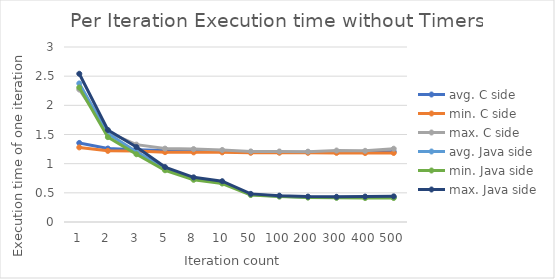
| Category | avg. C side | min. C side | max. C side | avg. Java side | min. Java side | max. Java side |
|---|---|---|---|---|---|---|
| 1.0 | 1.355 | 1.279 | 2.271 | 2.375 | 2.306 | 2.541 |
| 2.0 | 1.26 | 1.22 | 1.542 | 1.516 | 1.455 | 1.578 |
| 3.0 | 1.24 | 1.216 | 1.327 | 1.206 | 1.161 | 1.285 |
| 5.0 | 1.224 | 1.198 | 1.258 | 0.912 | 0.887 | 0.941 |
| 8.0 | 1.212 | 1.194 | 1.25 | 0.738 | 0.724 | 0.765 |
| 10.0 | 1.208 | 1.194 | 1.235 | 0.678 | 0.66 | 0.699 |
| 50.0 | 1.198 | 1.186 | 1.209 | 0.47 | 0.462 | 0.482 |
| 100.0 | 1.197 | 1.188 | 1.209 | 0.443 | 0.435 | 0.451 |
| 200.0 | 1.196 | 1.187 | 1.206 | 0.426 | 0.418 | 0.435 |
| 300.0 | 1.199 | 1.185 | 1.225 | 0.422 | 0.414 | 0.431 |
| 400.0 | 1.2 | 1.182 | 1.22 | 0.424 | 0.411 | 0.436 |
| 500.0 | 1.206 | 1.183 | 1.256 | 0.426 | 0.411 | 0.439 |